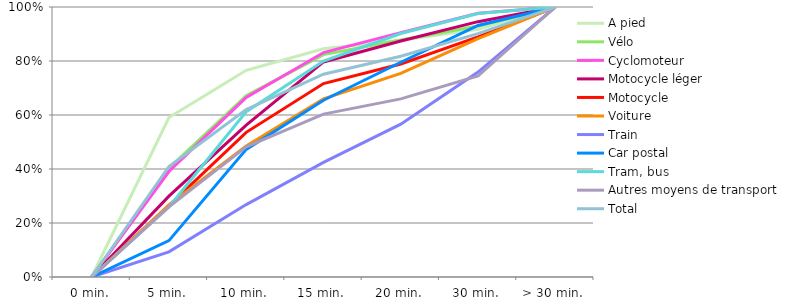
| Category | A pied | Vélo | Cyclomoteur | Motocycle léger | Motocycle | Voiture | Train | Car postal | Tram, bus | Autres moyens de transport | Total |
|---|---|---|---|---|---|---|---|---|---|---|---|
| 0 min. | 0 | 0 | 0 | 0 | 0 | 0 | 0 | 0 | 0 | 0 | 0 |
| 5 min. | 0.59 | 0.403 | 0.391 | 0.3 | 0.264 | 0.267 | 0.093 | 0.135 | 0.26 | 0.26 | 0.409 |
| 10 min. | 0.766 | 0.671 | 0.665 | 0.563 | 0.536 | 0.485 | 0.268 | 0.473 | 0.612 | 0.482 | 0.62 |
| 15 min. | 0.845 | 0.824 | 0.831 | 0.797 | 0.716 | 0.66 | 0.424 | 0.655 | 0.8 | 0.603 | 0.751 |
| 20 min. | 0.877 | 0.878 | 0.905 | 0.874 | 0.789 | 0.754 | 0.566 | 0.795 | 0.902 | 0.66 | 0.818 |
| 30 min. | 0.918 | 0.93 | 0.977 | 0.946 | 0.889 | 0.883 | 0.759 | 0.932 | 0.976 | 0.745 | 0.901 |
| > 30 min. | 1 | 1 | 1 | 1 | 1 | 1 | 1 | 1 | 1 | 1 | 1 |